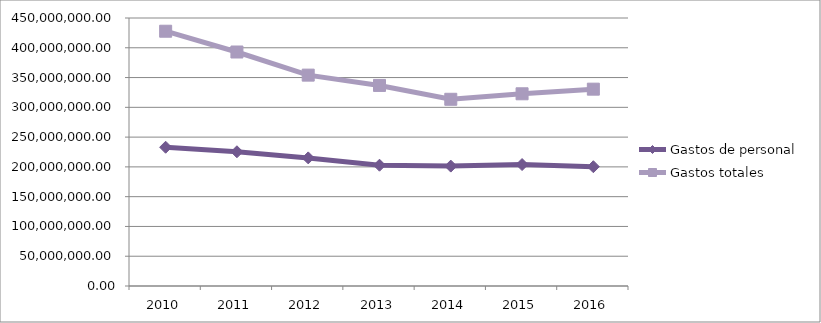
| Category | Gastos de personal  | Gastos totales  |
|---|---|---|
| 2010 | 232996506.31 | 427798689.84 |
| 2011 | 225391661.23 | 392907659.76 |
| 2012 | 215110369.31 | 354075378.3 |
| 2013 | 202787311.75 | 336783248.85 |
| 2014 | 201334556.05 | 313515763.33 |
| 2015 | 203930851.7 | 322731968.98 |
| 2016 | 200290475.98 | 330516726.43 |